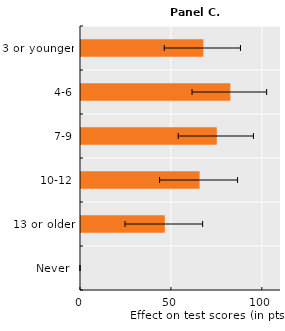
| Category | Series 0 |
|---|---|
| Never  | 0 |
| 13 or older | 46.1 |
| 10-12 | 65.216 |
| 7-9 | 74.694 |
| 4-6 | 82.138 |
| 3 or younger | 67.302 |